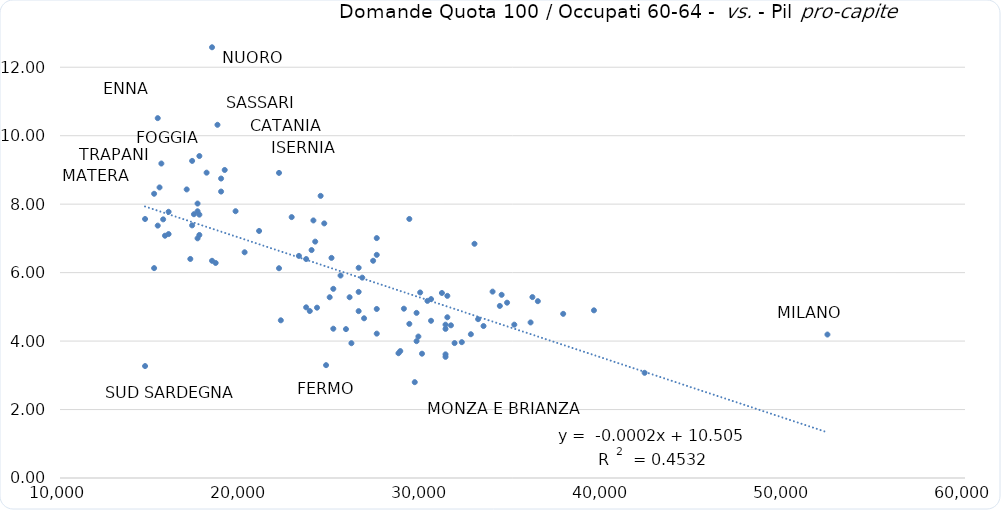
| Category | DOMANDE / 
proxy OCCUPATI anziani |
|---|---|
| 18400.0 | 12.583 |
| 15400.0 | 10.513 |
| 18700.0 | 10.318 |
| 17700.0 | 9.406 |
| 17300.0 | 9.263 |
| 15600.0 | 9.187 |
| 19100.0 | 8.999 |
| 18100.0 | 8.92 |
| 22100.0 | 8.913 |
| 18900.0 | 8.748 |
| 15500.0 | 8.489 |
| 17000.0 | 8.43 |
| 18900.0 | 8.368 |
| 15200.0 | 8.303 |
| 24400.0 | 8.242 |
| 17600.0 | 8.018 |
| 19700.0 | 7.794 |
| 17600.0 | 7.792 |
| 16000.0 | 7.776 |
| 17400.0 | 7.706 |
| 17700.0 | 7.694 |
| 22800.0 | 7.621 |
| 29300.0 | 7.567 |
| 14700.0 | 7.566 |
| 15700.0 | 7.556 |
| 24000.0 | 7.524 |
| 24600.0 | 7.437 |
| 17300.0 | 7.38 |
| 15400.0 | 7.373 |
| 21000.0 | 7.217 |
| 16000.0 | 7.126 |
| 17700.0 | 7.1 |
| 15800.0 | 7.078 |
| 27500.0 | 7.008 |
| 17600.0 | 7.002 |
| 24100.0 | 6.905 |
| 32900.0 | 6.842 |
| 23900.0 | 6.659 |
| 20200.0 | 6.594 |
| 27500.0 | 6.519 |
| 23200.0 | 6.489 |
| 25000.0 | 6.43 |
| 17200.0 | 6.399 |
| 23600.0 | 6.397 |
| 27300.0 | 6.346 |
| 18400.0 | 6.345 |
| 18600.0 | 6.282 |
| 26500.0 | 6.141 |
| 15200.0 | 6.131 |
| 22100.0 | 6.128 |
| 25500.0 | 5.915 |
| 26700.0 | 5.853 |
| 25100.0 | 5.526 |
| 33900.0 | 5.445 |
| 26500.0 | 5.436 |
| 29900.0 | 5.42 |
| 31100.0 | 5.405 |
| 34400.0 | 5.351 |
| 31400.0 | 5.321 |
| 36100.0 | 5.285 |
| 24900.0 | 5.281 |
| 26000.0 | 5.281 |
| 30500.0 | 5.226 |
| 30300.0 | 5.174 |
| 36400.0 | 5.166 |
| 34700.0 | 5.122 |
| 34300.0 | 5.027 |
| 23600.0 | 4.986 |
| 24200.0 | 4.976 |
| 29000.0 | 4.946 |
| 27500.0 | 4.938 |
| 39500.0 | 4.898 |
| 23800.0 | 4.878 |
| 26500.0 | 4.875 |
| 29700.0 | 4.824 |
| 37800.0 | 4.795 |
| 31400.0 | 4.695 |
| 26800.0 | 4.666 |
| 33100.0 | 4.64 |
| 22200.0 | 4.607 |
| 30500.0 | 4.593 |
| 36000.0 | 4.545 |
| 29300.0 | 4.502 |
| 35100.0 | 4.48 |
| 31300.0 | 4.479 |
| 31600.0 | 4.46 |
| 33400.0 | 4.439 |
| 25100.0 | 4.361 |
| 31300.0 | 4.356 |
| 25800.0 | 4.349 |
| 27500.0 | 4.217 |
| 32700.0 | 4.2 |
| 52400.0 | 4.191 |
| 29800.0 | 4.132 |
| 29700.0 | 3.998 |
| 32200.0 | 3.968 |
| 31800.0 | 3.942 |
| 26100.0 | 3.938 |
| 28800.0 | 3.708 |
| 28700.0 | 3.645 |
| 30000.0 | 3.631 |
| 31300.0 | 3.612 |
| 31300.0 | 3.54 |
| 24700.0 | 3.297 |
| 14700.0 | 3.27 |
| 42300.0 | 3.073 |
| 29600.0 | 2.8 |